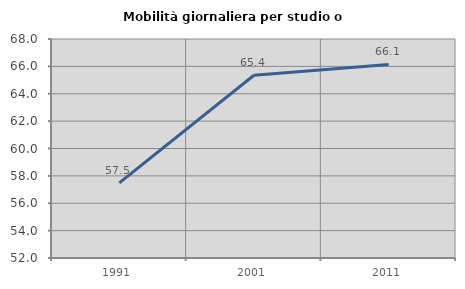
| Category | Mobilità giornaliera per studio o lavoro |
|---|---|
| 1991.0 | 57.494 |
| 2001.0 | 65.351 |
| 2011.0 | 66.14 |